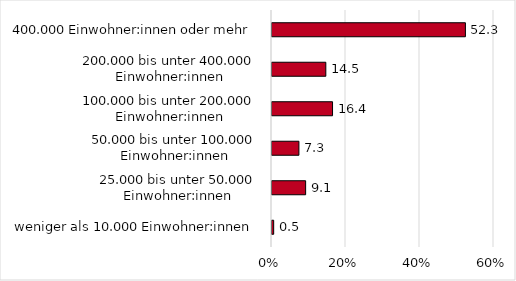
| Category | Series 0 |
|---|---|
| 400.000 Einwohner:innen oder mehr | 52.273 |
| 200.000 bis unter 400.000 Einwohner:innen | 14.545 |
| 100.000 bis unter 200.000 Einwohner:innen | 16.364 |
| 50.000 bis unter 100.000 Einwohner:innen | 7.273 |
| 25.000 bis unter 50.000 Einwohner:innen | 9.091 |
| weniger als 10.000 Einwohner:innen | 0.455 |